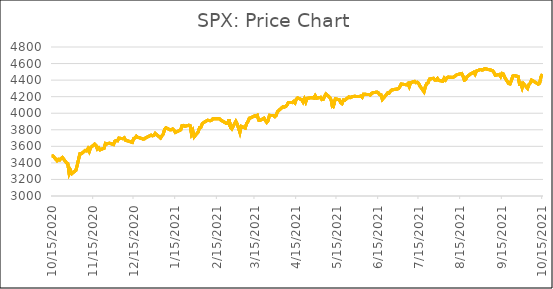
| Category | Series 2 | Series 3 | Series 1 | Series 0 |
|---|---|---|---|---|
| 10/15/20 | 3483.34 | 3483.34 | 3483.34 | 3483.34 |
| 10/16/20 | 3483.81 | 3483.81 | 3483.81 | 3483.81 |
| 10/19/20 | 3426.92 | 3426.92 | 3426.92 | 3426.92 |
| 10/20/20 | 3443.12 | 3443.12 | 3443.12 | 3443.12 |
| 10/21/20 | 3435.56 | 3435.56 | 3435.56 | 3435.56 |
| 10/22/20 | 3453.49 | 3453.49 | 3453.49 | 3453.49 |
| 10/23/20 | 3465.39 | 3465.39 | 3465.39 | 3465.39 |
| 10/26/20 | 3400.97 | 3400.97 | 3400.97 | 3400.97 |
| 10/27/20 | 3390.68 | 3390.68 | 3390.68 | 3390.68 |
| 10/28/20 | 3271.03 | 3271.03 | 3271.03 | 3271.03 |
| 10/29/20 | 3310.11 | 3310.11 | 3310.11 | 3310.11 |
| 10/30/20 | 3269.96 | 3269.96 | 3269.96 | 3269.96 |
| 11/2/20 | 3310.24 | 3310.24 | 3310.24 | 3310.24 |
| 11/3/20 | 3369.02 | 3369.02 | 3369.02 | 3369.02 |
| 11/4/20 | 3443.44 | 3443.44 | 3443.44 | 3443.44 |
| 11/5/20 | 3510.45 | 3510.45 | 3510.45 | 3510.45 |
| 11/6/20 | 3509.44 | 3509.44 | 3509.44 | 3509.44 |
| 11/9/20 | 3550.5 | 3550.5 | 3550.5 | 3550.5 |
| 11/10/20 | 3545.53 | 3545.53 | 3545.53 | 3545.53 |
| 11/11/20 | 3572.66 | 3572.66 | 3572.66 | 3572.66 |
| 11/12/20 | 3537.01 | 3537.01 | 3537.01 | 3537.01 |
| 11/13/20 | 3585.15 | 3585.15 | 3585.15 | 3585.15 |
| 11/16/20 | 3626.91 | 3626.91 | 3626.91 | 3626.91 |
| 11/17/20 | 3609.53 | 3609.53 | 3609.53 | 3609.53 |
| 11/18/20 | 3567.79 | 3567.79 | 3567.79 | 3567.79 |
| 11/19/20 | 3581.87 | 3581.87 | 3581.87 | 3581.87 |
| 11/20/20 | 3557.54 | 3557.54 | 3557.54 | 3557.54 |
| 11/23/20 | 3577.59 | 3577.59 | 3577.59 | 3577.59 |
| 11/24/20 | 3635.41 | 3635.41 | 3635.41 | 3635.41 |
| 11/25/20 | 3629.65 | 3629.65 | 3629.65 | 3629.65 |
| 11/27/20 | 3638.35 | 3638.35 | 3638.35 | 3638.35 |
| 11/30/20 | 3621.63 | 3621.63 | 3621.63 | 3621.63 |
| 12/1/20 | 3662.45 | 3662.45 | 3662.45 | 3662.45 |
| 12/2/20 | 3669.01 | 3669.01 | 3669.01 | 3669.01 |
| 12/3/20 | 3666.72 | 3666.72 | 3666.72 | 3666.72 |
| 12/4/20 | 3699.12 | 3699.12 | 3699.12 | 3699.12 |
| 12/7/20 | 3691.96 | 3691.96 | 3691.96 | 3691.96 |
| 12/8/20 | 3702.25 | 3702.25 | 3702.25 | 3702.25 |
| 12/9/20 | 3672.82 | 3672.82 | 3672.82 | 3672.82 |
| 12/10/20 | 3668.1 | 3668.1 | 3668.1 | 3668.1 |
| 12/11/20 | 3663.46 | 3663.46 | 3663.46 | 3663.46 |
| 12/14/20 | 3647.49 | 3647.49 | 3647.49 | 3647.49 |
| 12/15/20 | 3694.62 | 3694.62 | 3694.62 | 3694.62 |
| 12/16/20 | 3701.17 | 3701.17 | 3701.17 | 3701.17 |
| 12/17/20 | 3722.48 | 3722.48 | 3722.48 | 3722.48 |
| 12/18/20 | 3709.41 | 3709.41 | 3709.41 | 3709.41 |
| 12/21/20 | 3694.92 | 3694.92 | 3694.92 | 3694.92 |
| 12/22/20 | 3687.26 | 3687.26 | 3687.26 | 3687.26 |
| 12/23/20 | 3690.01 | 3690.01 | 3690.01 | 3690.01 |
| 12/24/20 | 3703.06 | 3703.06 | 3703.06 | 3703.06 |
| 12/28/20 | 3735.36 | 3735.36 | 3735.36 | 3735.36 |
| 12/29/20 | 3727.04 | 3727.04 | 3727.04 | 3727.04 |
| 12/30/20 | 3732.04 | 3732.04 | 3732.04 | 3732.04 |
| 12/31/20 | 3756.07 | 3756.07 | 3756.07 | 3756.07 |
| 1/4/21 | 3700.65 | 3700.65 | 3700.65 | 3700.65 |
| 1/5/21 | 3726.86 | 3726.86 | 3726.86 | 3726.86 |
| 1/6/21 | 3748.14 | 3748.14 | 3748.14 | 3748.14 |
| 1/7/21 | 3803.79 | 3803.79 | 3803.79 | 3803.79 |
| 1/8/21 | 3824.68 | 3824.68 | 3824.68 | 3824.68 |
| 1/11/21 | 3799.61 | 3799.61 | 3799.61 | 3799.61 |
| 1/12/21 | 3801.19 | 3801.19 | 3801.19 | 3801.19 |
| 1/13/21 | 3809.84 | 3809.84 | 3809.84 | 3809.84 |
| 1/14/21 | 3795.54 | 3795.54 | 3795.54 | 3795.54 |
| 1/15/21 | 3768.25 | 3768.25 | 3768.25 | 3768.25 |
| 1/19/21 | 3798.91 | 3798.91 | 3798.91 | 3798.91 |
| 1/20/21 | 3851.85 | 3851.85 | 3851.85 | 3851.85 |
| 1/21/21 | 3853.07 | 3853.07 | 3853.07 | 3853.07 |
| 1/22/21 | 3841.47 | 3841.47 | 3841.47 | 3841.47 |
| 1/25/21 | 3855.36 | 3855.36 | 3855.36 | 3855.36 |
| 1/26/21 | 3849.62 | 3849.62 | 3849.62 | 3849.62 |
| 1/27/21 | 3750.77 | 3750.77 | 3750.77 | 3750.77 |
| 1/28/21 | 3787.38 | 3787.38 | 3787.38 | 3787.38 |
| 1/29/21 | 3714.24 | 3714.24 | 3714.24 | 3714.24 |
| 2/1/21 | 3773.86 | 3773.86 | 3773.86 | 3773.86 |
| 2/2/21 | 3826.31 | 3826.31 | 3826.31 | 3826.31 |
| 2/3/21 | 3830.17 | 3830.17 | 3830.17 | 3830.17 |
| 2/4/21 | 3871.74 | 3871.74 | 3871.74 | 3871.74 |
| 2/5/21 | 3886.83 | 3886.83 | 3886.83 | 3886.83 |
| 2/8/21 | 3915.59 | 3915.59 | 3915.59 | 3915.59 |
| 2/9/21 | 3911.23 | 3911.23 | 3911.23 | 3911.23 |
| 2/10/21 | 3909.88 | 3909.88 | 3909.88 | 3909.88 |
| 2/11/21 | 3916.38 | 3916.38 | 3916.38 | 3916.38 |
| 2/12/21 | 3934.83 | 3934.83 | 3934.83 | 3934.83 |
| 2/16/21 | 3932.59 | 3932.59 | 3932.59 | 3932.59 |
| 2/17/21 | 3931.33 | 3931.33 | 3931.33 | 3931.33 |
| 2/18/21 | 3913.97 | 3913.97 | 3913.97 | 3913.97 |
| 2/19/21 | 3906.71 | 3906.71 | 3906.71 | 3906.71 |
| 2/22/21 | 3876.5 | 3876.5 | 3876.5 | 3876.5 |
| 2/23/21 | 3881.37 | 3881.37 | 3881.37 | 3881.37 |
| 2/24/21 | 3925.43 | 3925.43 | 3925.43 | 3925.43 |
| 2/25/21 | 3829.34 | 3829.34 | 3829.34 | 3829.34 |
| 2/26/21 | 3811.15 | 3811.15 | 3811.15 | 3811.15 |
| 3/1/21 | 3901.82 | 3901.82 | 3901.82 | 3901.82 |
| 3/2/21 | 3870.29 | 3870.29 | 3870.29 | 3870.29 |
| 3/3/21 | 3819.72 | 3819.72 | 3819.72 | 3819.72 |
| 3/4/21 | 3768.47 | 3768.47 | 3768.47 | 3768.47 |
| 3/5/21 | 3841.94 | 3841.94 | 3841.94 | 3841.94 |
| 3/8/21 | 3821.35 | 3821.35 | 3821.35 | 3821.35 |
| 3/9/21 | 3875.44 | 3875.44 | 3875.44 | 3875.44 |
| 3/10/21 | 3898.81 | 3898.81 | 3898.81 | 3898.81 |
| 3/11/21 | 3939.34 | 3939.34 | 3939.34 | 3939.34 |
| 3/12/21 | 3943.34 | 3943.34 | 3943.34 | 3943.34 |
| 3/15/21 | 3968.94 | 3968.94 | 3968.94 | 3968.94 |
| 3/16/21 | 3962.71 | 3962.71 | 3962.71 | 3962.71 |
| 3/17/21 | 3974.12 | 3974.12 | 3974.12 | 3974.12 |
| 3/18/21 | 3915.46 | 3915.46 | 3915.46 | 3915.46 |
| 3/19/21 | 3913.1 | 3913.1 | 3913.1 | 3913.1 |
| 3/22/21 | 3940.59 | 3940.59 | 3940.59 | 3940.59 |
| 3/23/21 | 3910.52 | 3910.52 | 3910.52 | 3910.52 |
| 3/24/21 | 3889.14 | 3889.14 | 3889.14 | 3889.14 |
| 3/25/21 | 3909.52 | 3909.52 | 3909.52 | 3909.52 |
| 3/26/21 | 3974.54 | 3974.54 | 3974.54 | 3974.54 |
| 3/29/21 | 3971.09 | 3971.09 | 3971.09 | 3971.09 |
| 3/30/21 | 3958.55 | 3958.55 | 3958.55 | 3958.55 |
| 3/31/21 | 3972.89 | 3972.89 | 3972.89 | 3972.89 |
| 4/1/21 | 4019.87 | 4019.87 | 4019.87 | 4019.87 |
| 4/5/21 | 4077.91 | 4077.91 | 4077.91 | 4077.91 |
| 4/6/21 | 4073.94 | 4073.94 | 4073.94 | 4073.94 |
| 4/7/21 | 4079.95 | 4079.95 | 4079.95 | 4079.95 |
| 4/8/21 | 4097.17 | 4097.17 | 4097.17 | 4097.17 |
| 4/9/21 | 4128.8 | 4128.8 | 4128.8 | 4128.8 |
| 4/12/21 | 4127.99 | 4127.99 | 4127.99 | 4127.99 |
| 4/13/21 | 4141.59 | 4141.59 | 4141.59 | 4141.59 |
| 4/14/21 | 4124.66 | 4124.66 | 4124.66 | 4124.66 |
| 4/15/21 | 4170.42 | 4170.42 | 4170.42 | 4170.42 |
| 4/16/21 | 4185.47 | 4185.47 | 4185.47 | 4185.47 |
| 4/19/21 | 4163.26 | 4163.26 | 4163.26 | 4163.26 |
| 4/20/21 | 4134.94 | 4134.94 | 4134.94 | 4134.94 |
| 4/21/21 | 4173.42 | 4173.42 | 4173.42 | 4173.42 |
| 4/22/21 | 4134.98 | 4134.98 | 4134.98 | 4134.98 |
| 4/23/21 | 4180.17 | 4180.17 | 4180.17 | 4180.17 |
| 4/26/21 | 4187.62 | 4187.62 | 4187.62 | 4187.62 |
| 4/27/21 | 4186.72 | 4186.72 | 4186.72 | 4186.72 |
| 4/28/21 | 4183.18 | 4183.18 | 4183.18 | 4183.18 |
| 4/29/21 | 4211.47 | 4211.47 | 4211.47 | 4211.47 |
| 4/30/21 | 4181.17 | 4181.17 | 4181.17 | 4181.17 |
| 5/3/21 | 4192.66 | 4192.66 | 4192.66 | 4192.66 |
| 5/4/21 | 4164.66 | 4164.66 | 4164.66 | 4164.66 |
| 5/5/21 | 4167.59 | 4167.59 | 4167.59 | 4167.59 |
| 5/6/21 | 4201.62 | 4201.62 | 4201.62 | 4201.62 |
| 5/7/21 | 4232.6 | 4232.6 | 4232.6 | 4232.6 |
| 5/10/21 | 4188.43 | 4188.43 | 4188.43 | 4188.43 |
| 5/11/21 | 4152.1 | 4152.1 | 4152.1 | 4152.1 |
| 5/12/21 | 4063.04 | 4063.04 | 4063.04 | 4063.04 |
| 5/13/21 | 4112.5 | 4112.5 | 4112.5 | 4112.5 |
| 5/14/21 | 4173.85 | 4173.85 | 4173.85 | 4173.85 |
| 5/17/21 | 4163.29 | 4163.29 | 4163.29 | 4163.29 |
| 5/18/21 | 4127.83 | 4127.83 | 4127.83 | 4127.83 |
| 5/19/21 | 4115.68 | 4115.68 | 4115.68 | 4115.68 |
| 5/20/21 | 4159.12 | 4159.12 | 4159.12 | 4159.12 |
| 5/21/21 | 4155.86 | 4155.86 | 4155.86 | 4155.86 |
| 5/24/21 | 4197.05 | 4197.05 | 4197.05 | 4197.05 |
| 5/25/21 | 4188.13 | 4188.13 | 4188.13 | 4188.13 |
| 5/26/21 | 4195.99 | 4195.99 | 4195.99 | 4195.99 |
| 5/27/21 | 4200.88 | 4200.88 | 4200.88 | 4200.88 |
| 5/28/21 | 4204.11 | 4204.11 | 4204.11 | 4204.11 |
| 6/1/21 | 4202.04 | 4202.04 | 4202.04 | 4202.04 |
| 6/2/21 | 4208.12 | 4208.12 | 4208.12 | 4208.12 |
| 6/3/21 | 4192.85 | 4192.85 | 4192.85 | 4192.85 |
| 6/4/21 | 4229.89 | 4229.89 | 4229.89 | 4229.89 |
| 6/7/21 | 4226.52 | 4226.52 | 4226.52 | 4226.52 |
| 6/8/21 | 4227.26 | 4227.26 | 4227.26 | 4227.26 |
| 6/9/21 | 4219.55 | 4219.55 | 4219.55 | 4219.55 |
| 6/10/21 | 4239.18 | 4239.18 | 4239.18 | 4239.18 |
| 6/11/21 | 4247.44 | 4247.44 | 4247.44 | 4247.44 |
| 6/14/21 | 4255.15 | 4255.15 | 4255.15 | 4255.15 |
| 6/15/21 | 4246.59 | 4246.59 | 4246.59 | 4246.59 |
| 6/16/21 | 4223.7 | 4223.7 | 4223.7 | 4223.7 |
| 6/17/21 | 4221.86 | 4221.86 | 4221.86 | 4221.86 |
| 6/18/21 | 4166.45 | 4166.45 | 4166.45 | 4166.45 |
| 6/21/21 | 4224.79 | 4224.79 | 4224.79 | 4224.79 |
| 6/22/21 | 4246.44 | 4246.44 | 4246.44 | 4246.44 |
| 6/23/21 | 4241.84 | 4241.84 | 4241.84 | 4241.84 |
| 6/24/21 | 4266.49 | 4266.49 | 4266.49 | 4266.49 |
| 6/25/21 | 4280.7 | 4280.7 | 4280.7 | 4280.7 |
| 6/28/21 | 4290.61 | 4290.61 | 4290.61 | 4290.61 |
| 6/29/21 | 4291.8 | 4291.8 | 4291.8 | 4291.8 |
| 6/30/21 | 4297.5 | 4297.5 | 4297.5 | 4297.5 |
| 7/1/21 | 4319.94 | 4319.94 | 4319.94 | 4319.94 |
| 7/2/21 | 4352.34 | 4352.34 | 4352.34 | 4352.34 |
| 7/6/21 | 4343.54 | 4343.54 | 4343.54 | 4343.54 |
| 7/7/21 | 4358.13 | 4358.13 | 4358.13 | 4358.13 |
| 7/8/21 | 4320.82 | 4320.82 | 4320.82 | 4320.82 |
| 7/9/21 | 4369.55 | 4369.55 | 4369.55 | 4369.55 |
| 7/12/21 | 4384.63 | 4384.63 | 4384.63 | 4384.63 |
| 7/13/21 | 4369.21 | 4369.21 | 4369.21 | 4369.21 |
| 7/14/21 | 4374.3 | 4374.3 | 4374.3 | 4374.3 |
| 7/15/21 | 4360.03 | 4360.03 | 4360.03 | 4360.03 |
| 7/16/21 | 4327.16 | 4327.16 | 4327.16 | 4327.16 |
| 7/19/21 | 4258.49 | 4258.49 | 4258.49 | 4258.49 |
| 7/20/21 | 4323.06 | 4323.06 | 4323.06 | 4323.06 |
| 7/21/21 | 4358.69 | 4358.69 | 4358.69 | 4358.69 |
| 7/22/21 | 4367.48 | 4367.48 | 4367.48 | 4367.48 |
| 7/23/21 | 4411.79 | 4411.79 | 4411.79 | 4411.79 |
| 7/26/21 | 4422.3 | 4422.3 | 4422.3 | 4422.3 |
| 7/27/21 | 4401.46 | 4401.46 | 4401.46 | 4401.46 |
| 7/28/21 | 4400.64 | 4400.64 | 4400.64 | 4400.64 |
| 7/29/21 | 4419.15 | 4419.15 | 4419.15 | 4419.15 |
| 7/30/21 | 4395.26 | 4395.26 | 4395.26 | 4395.26 |
| 8/2/21 | 4387.16 | 4387.16 | 4387.16 | 4387.16 |
| 8/3/21 | 4423.15 | 4423.15 | 4423.15 | 4423.15 |
| 8/4/21 | 4402.66 | 4402.66 | 4402.66 | 4402.66 |
| 8/5/21 | 4429.1 | 4429.1 | 4429.1 | 4429.1 |
| 8/6/21 | 4436.52 | 4436.52 | 4436.52 | 4436.52 |
| 8/9/21 | 4432.35 | 4432.35 | 4432.35 | 4432.35 |
| 8/10/21 | 4436.75 | 4436.75 | 4436.75 | 4436.75 |
| 8/11/21 | 4447.7 | 4447.7 | 4447.7 | 4447.7 |
| 8/12/21 | 4460.83 | 4460.83 | 4460.83 | 4460.83 |
| 8/13/21 | 4468 | 4468 | 4468 | 4468 |
| 8/16/21 | 4479.71 | 4479.71 | 4479.71 | 4479.71 |
| 8/17/21 | 4448.08 | 4448.08 | 4448.08 | 4448.08 |
| 8/18/21 | 4400.27 | 4400.27 | 4400.27 | 4400.27 |
| 8/19/21 | 4405.8 | 4405.8 | 4405.8 | 4405.8 |
| 8/20/21 | 4441.67 | 4441.67 | 4441.67 | 4441.67 |
| 8/23/21 | 4479.53 | 4479.53 | 4479.53 | 4479.53 |
| 8/24/21 | 4486.23 | 4486.23 | 4486.23 | 4486.23 |
| 8/25/21 | 4496.19 | 4496.19 | 4496.19 | 4496.19 |
| 8/26/21 | 4470 | 4470 | 4470 | 4470 |
| 8/27/21 | 4509.37 | 4509.37 | 4509.37 | 4509.37 |
| 8/30/21 | 4528.79 | 4528.79 | 4528.79 | 4528.79 |
| 8/31/21 | 4522.68 | 4522.68 | 4522.68 | 4522.68 |
| 9/1/21 | 4524.09 | 4524.09 | 4524.09 | 4524.09 |
| 9/2/21 | 4536.95 | 4536.95 | 4536.95 | 4536.95 |
| 9/3/21 | 4535.43 | 4535.43 | 4535.43 | 4535.43 |
| 9/7/21 | 4520.03 | 4520.03 | 4520.03 | 4520.03 |
| 9/8/21 | 4514.07 | 4514.07 | 4514.07 | 4514.07 |
| 9/9/21 | 4493.28 | 4493.28 | 4493.28 | 4493.28 |
| 9/10/21 | 4458.58 | 4458.58 | 4458.58 | 4458.58 |
| 9/13/21 | 4468.73 | 4468.73 | 4468.73 | 4468.73 |
| 9/14/21 | 4443.05 | 4443.05 | 4443.05 | 4443.05 |
| 9/15/21 | 4480.7 | 4480.7 | 4480.7 | 4480.7 |
| 9/16/21 | 4473.75 | 4473.75 | 4473.75 | 4473.75 |
| 9/17/21 | 4432.99 | 4432.99 | 4432.99 | 4432.99 |
| 9/20/21 | 4357.73 | 4357.73 | 4357.73 | 4357.73 |
| 9/21/21 | 4354.19 | 4354.19 | 4354.19 | 4354.19 |
| 9/22/21 | 4395.64 | 4395.64 | 4395.64 | 4395.64 |
| 9/23/21 | 4448.98 | 4448.98 | 4448.98 | 4448.98 |
| 9/24/21 | 4455.48 | 4455.48 | 4455.48 | 4455.48 |
| 9/27/21 | 4443.11 | 4443.11 | 4443.11 | 4443.11 |
| 9/28/21 | 4352.63 | 4352.63 | 4352.63 | 4352.63 |
| 9/29/21 | 4359.46 | 4359.46 | 4359.46 | 4359.46 |
| 9/30/21 | 4307.54 | 4307.54 | 4307.54 | 4307.54 |
| 10/1/21 | 4357.04 | 4357.04 | 4357.04 | 4357.04 |
| 10/4/21 | 4300.46 | 4300.46 | 4300.46 | 4300.46 |
| 10/5/21 | 4345.72 | 4345.72 | 4345.72 | 4345.72 |
| 10/6/21 | 4363.55 | 4363.55 | 4363.55 | 4363.55 |
| 10/7/21 | 4399.76 | 4399.76 | 4399.76 | 4399.76 |
| 10/8/21 | 4391.34 | 4391.34 | 4391.34 | 4391.34 |
| 10/11/21 | 4361.19 | 4361.19 | 4361.19 | 4361.19 |
| 10/12/21 | 4350.65 | 4350.65 | 4350.65 | 4350.65 |
| 10/13/21 | 4363.8 | 4363.8 | 4363.8 | 4363.8 |
| 10/14/21 | 4438.26 | 4438.26 | 4438.26 | 4438.26 |
| 10/15/21 | 4471.37 | 4471.37 | 4471.37 | 4471.37 |